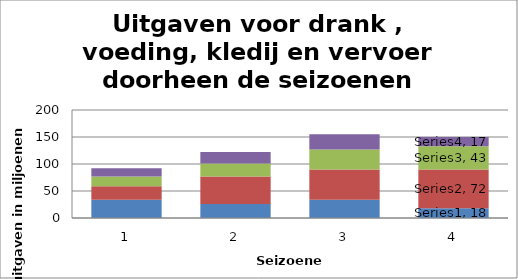
| Category | Series 0 | Series 1 | Series 2 | Series 3 |
|---|---|---|---|---|
| 0 | 34 | 25 | 18 | 15 |
| 1 | 26 | 51 | 24 | 21 |
| 2 | 34 | 56 | 37 | 28 |
| 3 | 18 | 72 | 43 | 17 |